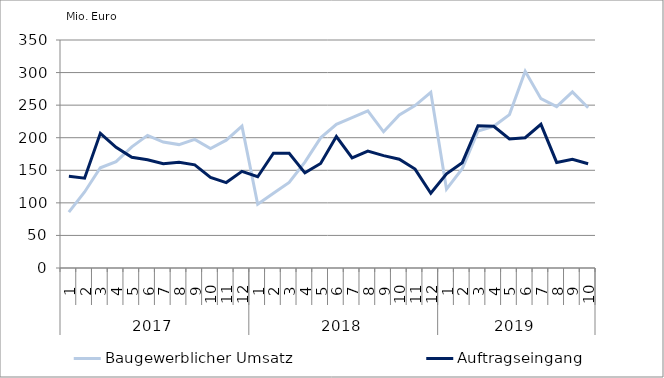
| Category | Baugewerblicher Umsatz | Auftragseingang |
|---|---|---|
| 0 | 85701.947 | 140751.008 |
| 1 | 116743.276 | 137863.383 |
| 2 | 153810.055 | 206710.579 |
| 3 | 163342.989 | 185183.797 |
| 4 | 185946.221 | 169878.51 |
| 5 | 203627.91 | 166148.392 |
| 6 | 193377.256 | 160134.206 |
| 7 | 189429.952 | 162221.206 |
| 8 | 197405.279 | 158305.285 |
| 9 | 183450.026 | 139156.761 |
| 10 | 196209.214 | 131165.419 |
| 11 | 217688.447 | 148434.901 |
| 12 | 97959.056 | 140119.385 |
| 13 | 114756.787 | 176330.213 |
| 14 | 131454.642 | 176241.061 |
| 15 | 162648.053 | 146063.407 |
| 16 | 199809.407 | 160551.931 |
| 17 | 220535.974 | 201835.846 |
| 18 | 230672.472 | 169132.23 |
| 19 | 241233.619 | 179396.293 |
| 20 | 209099.292 | 172542.764 |
| 21 | 234953.007 | 166991.729 |
| 22 | 249410.043 | 151835.629 |
| 23 | 269773.227 | 114807.456 |
| 24 | 120975.133 | 144510.881 |
| 25 | 152329.786 | 161685.201 |
| 26 | 210227.67 | 218455.879 |
| 27 | 217522.321 | 217610.064 |
| 28 | 235490.429 | 198110.439 |
| 29 | 301963.302 | 200012.086 |
| 30 | 259975.317 | 220559.061 |
| 31 | 247779.658 | 162059.723 |
| 32 | 270249.609 | 166829.611 |
| 33 | 245966.91 | 160120.773 |